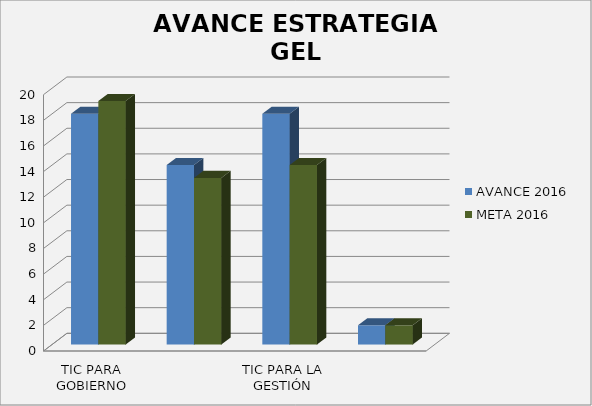
| Category | AVANCE 2016 | META 2016 |
|---|---|---|
| TIC PARA GOBIERNO ABIERTO | 18 | 19 |
| TIC PARA SERVICIOS | 14 | 13 |
| TIC PARA LA GESTIÓN | 18 | 14 |
| SEGURIDAD Y PRIVACIDAD DE LA INFORMACIÓN | 1.5 | 1.5 |